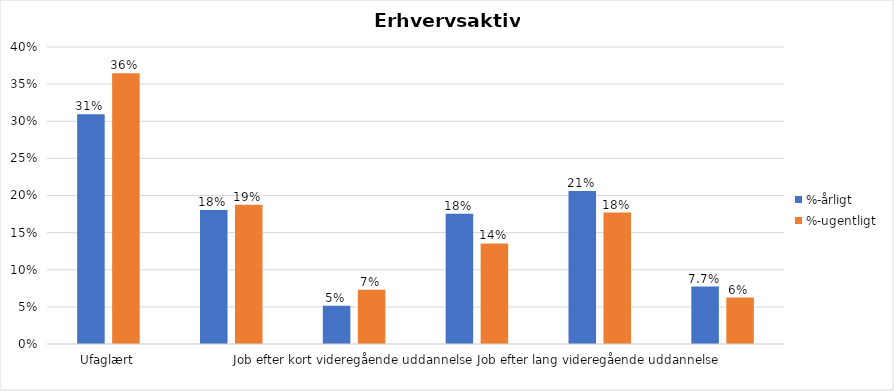
| Category | %-årligt | %-ugentligt |
|---|---|---|
| Ufaglært | 0.309 | 0.365 |
| Erhvervsfagligt job | 0.18 | 0.188 |
| Job efter kort videregående uddannelse | 0.052 | 0.073 |
| Job efter mellemlang videregående uddannelse | 0.175 | 0.135 |
| Job efter lang videregående uddannelse | 0.206 | 0.177 |
| Selvstændig | 0.077 | 0.062 |